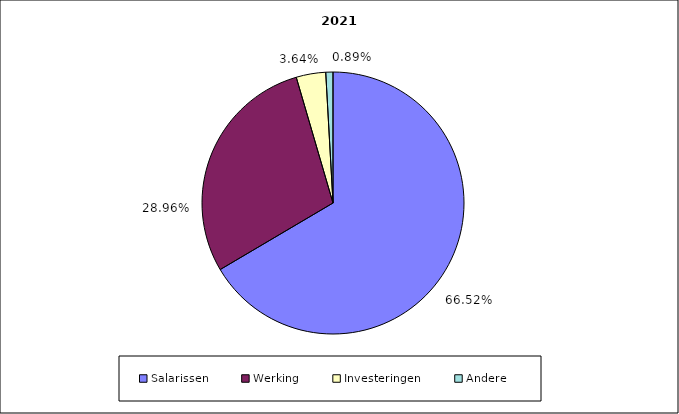
| Category | 2021 |
|---|---|
| Salarissen | 9096468 |
| Werking | 3960056.881 |
| Investeringen | 497822 |
| Andere | 121282 |